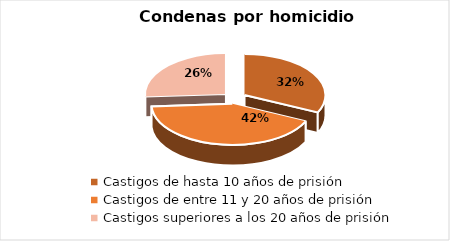
| Category | Series 0 |
|---|---|
| Castigos de hasta 10 años de prisión | 0.32 |
| Castigos de entre 11 y 20 años de prisión | 0.42 |
| Castigos superiores a los 20 años de prisión | 0.26 |